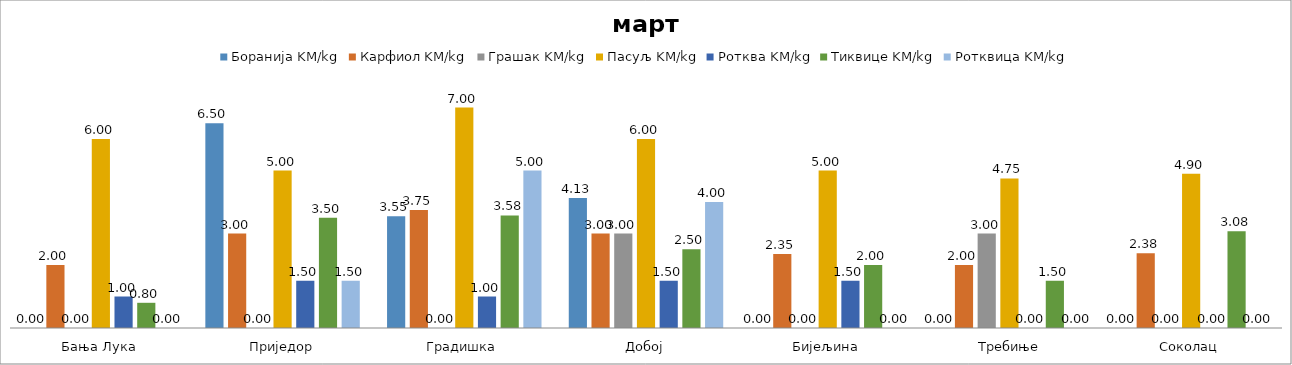
| Category | Боранија KM/kg | Карфиол KM/kg | Грашак KM/kg | Пасуљ KM/kg | Ротква KM/kg | Тиквице KM/kg | Ротквица KM/kg |
|---|---|---|---|---|---|---|---|
| Бања Лука | 0 | 2 | 0 | 6 | 1 | 0.8 | 0 |
| Приједор | 6.5 | 3 | 0 | 5 | 1.5 | 3.5 | 1.5 |
| Градишка | 3.55 | 3.75 | 0 | 7 | 1 | 3.575 | 5 |
| Добој | 4.125 | 3 | 3 | 6 | 1.5 | 2.5 | 4 |
| Бијељина | 0 | 2.35 | 0 | 5 | 1.5 | 2 | 0 |
|  Требиње | 0 | 2 | 3 | 4.75 | 0 | 1.5 | 0 |
| Соколац | 0 | 2.375 | 0 | 4.9 | 0 | 3.075 | 0 |